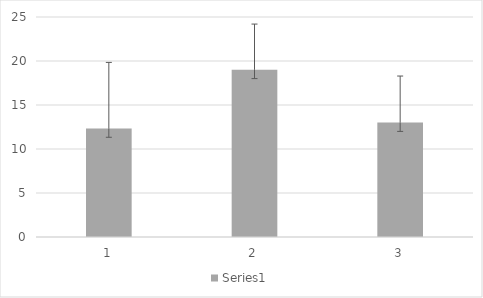
| Category | Series 0 |
|---|---|
| 0 | 12.333 |
| 1 | 19 |
| 2 | 13 |